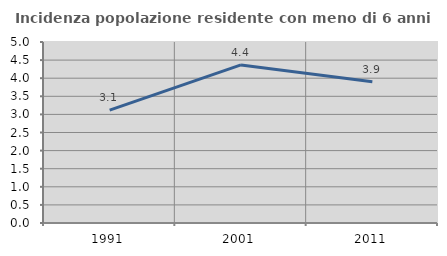
| Category | Incidenza popolazione residente con meno di 6 anni |
|---|---|
| 1991.0 | 3.118 |
| 2001.0 | 4.367 |
| 2011.0 | 3.899 |